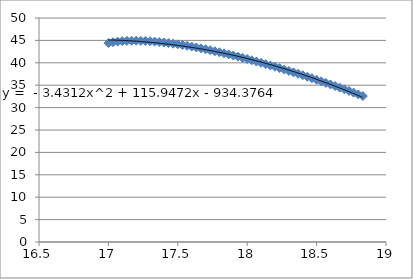
| Category | Series 0 |
|---|---|
| 17.0 | 44.402 |
| 17.033333333333335 | 44.593 |
| 17.066666666666666 | 44.735 |
| 17.1 | 44.832 |
| 17.133333333333333 | 44.895 |
| 17.166666666666668 | 44.927 |
| 17.2 | 44.93 |
| 17.233333333333334 | 44.912 |
| 17.266666666666666 | 44.87 |
| 17.3 | 44.81 |
| 17.333333333333332 | 44.733 |
| 17.366666666666667 | 44.638 |
| 17.4 | 44.53 |
| 17.433333333333334 | 44.407 |
| 17.466666666666665 | 44.272 |
| 17.5 | 44.123 |
| 17.533333333333335 | 43.965 |
| 17.566666666666666 | 43.795 |
| 17.6 | 43.617 |
| 17.633333333333333 | 43.427 |
| 17.666666666666668 | 43.228 |
| 17.7 | 43.022 |
| 17.733333333333334 | 42.808 |
| 17.766666666666666 | 42.585 |
| 17.8 | 42.355 |
| 17.833333333333332 | 42.118 |
| 17.866666666666667 | 41.875 |
| 17.9 | 41.625 |
| 17.933333333333334 | 41.368 |
| 17.966666666666665 | 41.107 |
| 18.0 | 40.838 |
| 18.033333333333335 | 40.565 |
| 18.066666666666666 | 40.285 |
| 18.1 | 40 |
| 18.133333333333333 | 39.71 |
| 18.166666666666668 | 39.415 |
| 18.2 | 39.117 |
| 18.233333333333334 | 38.812 |
| 18.266666666666666 | 38.502 |
| 18.3 | 38.188 |
| 18.333333333333332 | 37.87 |
| 18.366666666666667 | 37.547 |
| 18.4 | 37.22 |
| 18.433333333333334 | 36.888 |
| 18.466666666666665 | 36.552 |
| 18.5 | 36.212 |
| 18.533333333333335 | 35.868 |
| 18.566666666666666 | 35.52 |
| 18.6 | 35.167 |
| 18.633333333333333 | 34.81 |
| 18.666666666666668 | 34.448 |
| 18.7 | 34.083 |
| 18.733333333333334 | 33.715 |
| 18.766666666666666 | 33.342 |
| 18.8 | 32.963 |
| 18.833333333333332 | 32.582 |